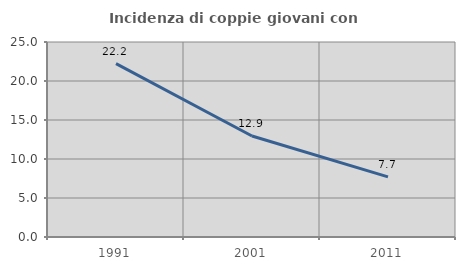
| Category | Incidenza di coppie giovani con figli |
|---|---|
| 1991.0 | 22.222 |
| 2001.0 | 12.95 |
| 2011.0 | 7.711 |